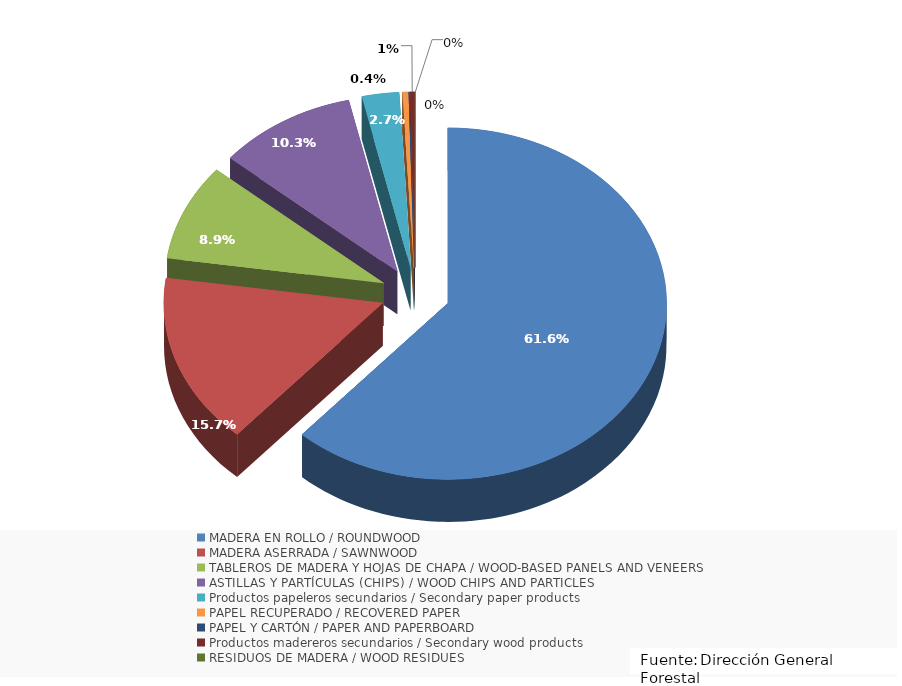
| Category | Series 0 |
|---|---|
| MADERA EN ROLLO / ROUNDWOOD | 61.592 |
| MADERA ASERRADA / SAWNWOOD | 15.678 |
| TABLEROS DE MADERA Y HOJAS DE CHAPA / WOOD-BASED PANELS AND VENEERS | 8.891 |
| ASTILLAS Y PARTÍCULAS (CHIPS) / WOOD CHIPS AND PARTICLES | 10.263 |
| Productos papeleros secundarios / Secondary paper products | 2.734 |
| PAPEL RECUPERADO / RECOVERED PAPER | 0.413 |
| PAPEL Y CARTÓN / PAPER AND PAPERBOARD | 0.04 |
| Productos madereros secundarios / Secondary wood products | 0.388 |
| RESIDUOS DE MADERA / WOOD RESIDUES | 0 |